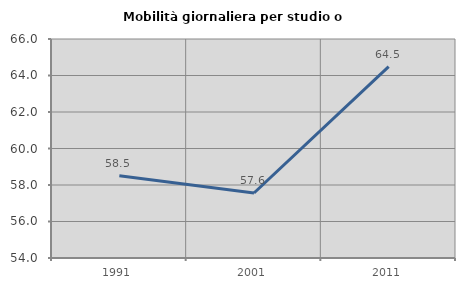
| Category | Mobilità giornaliera per studio o lavoro |
|---|---|
| 1991.0 | 58.504 |
| 2001.0 | 57.56 |
| 2011.0 | 64.491 |